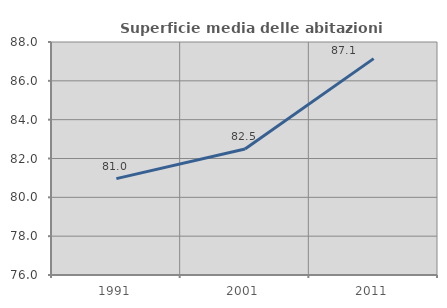
| Category | Superficie media delle abitazioni occupate |
|---|---|
| 1991.0 | 80.962 |
| 2001.0 | 82.494 |
| 2011.0 | 87.145 |